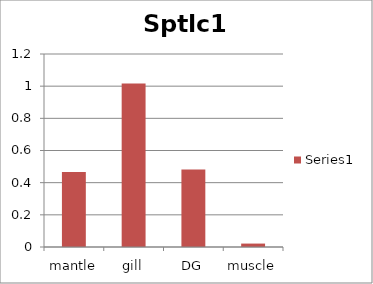
| Category | Series 0 |
|---|---|
| mantle | 0.466 |
| gill | 1.016 |
| DG | 0.481 |
| muscle | 0.021 |